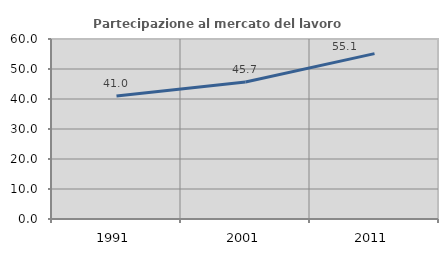
| Category | Partecipazione al mercato del lavoro  femminile |
|---|---|
| 1991.0 | 40.996 |
| 2001.0 | 45.664 |
| 2011.0 | 55.13 |